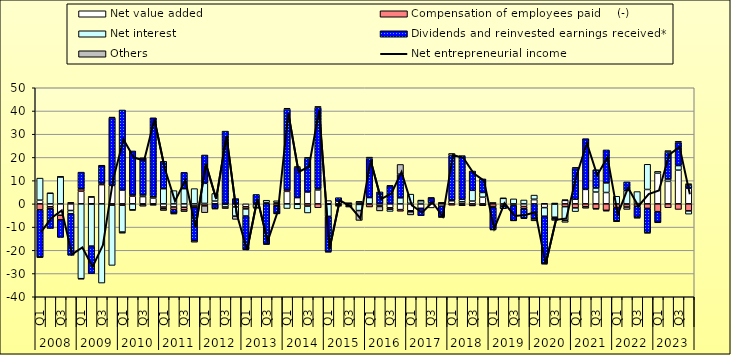
| Category | Net value added  | Compensation of employees paid    (-) | Net interest | Dividends and reinvested earnings received*  | Others |
|---|---|---|---|---|---|
| 0 | 1.59 | -2.55 | 9.5 | -20.36 | -0.1 |
| 1 | -1.24 | -0.85 | 4.57 | -8.5 | 0.02 |
| 2 | -4.88 | -1.98 | 11.64 | -7.58 | 0.04 |
| 3 | -2.85 | 0.42 | -1.43 | -17.85 | 0.11 |
| 4 | 5.44 | 1.01 | -32.22 | 7.22 | -0.11 |
| 5 | 2.99 | -0.09 | -18.1 | -11.84 | 0.07 |
| 6 | 8.28 | 0.65 | -34.11 | 7.5 | 0.03 |
| 7 | 7.94 | -0.55 | -25.95 | 29.09 | 0.35 |
| 8 | 5.97 | -0.56 | -11.59 | 34.46 | -0.49 |
| 9 | 3.29 | 0.55 | -2.58 | 18.96 | -0.17 |
| 10 | 3.13 | -0.35 | 0.71 | 16.02 | -0.68 |
| 11 | 2.47 | -0.22 | 0.59 | 34.01 | -0.4 |
| 12 | -1.36 | -0.77 | 6.53 | 11.79 | -0.74 |
| 13 | -1.34 | -1.12 | 5.71 | -1.51 | -0.43 |
| 14 | -1.44 | -1.11 | 6.53 | 7.04 | -0.78 |
| 15 | -0.9 | -0.54 | 6.57 | -14.43 | -0.64 |
| 16 | 0.19 | -0.87 | 8.65 | 12.22 | -2.92 |
| 17 | 1.19 | -0.1 | 3.28 | -1.75 | -0.41 |
| 18 | -0.19 | 0.06 | -1.15 | 31.27 | -0.69 |
| 19 | -1.32 | 0.05 | -3.96 | 2.24 | -1.4 |
| 20 | -1.25 | -0.92 | -3.07 | -14.38 | -0.13 |
| 21 | -0.28 | 0.17 | -1.24 | 3.89 | -0.34 |
| 22 | 0.46 | 0.09 | 1.02 | -17.23 | -0.28 |
| 23 | 0.55 | -0.81 | 0.79 | -3.32 | -0.08 |
| 24 | 5.38 | 0.63 | -2.01 | 34.84 | 0.33 |
| 25 | 2.69 | -0.14 | -2.01 | 13.1 | 0.21 |
| 26 | 5.12 | -0.95 | -2.97 | 14.54 | 0.37 |
| 27 | 5.98 | -1.67 | 0.7 | 34.79 | 0.5 |
| 28 | 1.41 | -0.18 | -5.19 | -15.17 | -0.28 |
| 29 | 1.09 | -0.42 | -0.22 | 1.58 | -0.37 |
| 30 | 0.51 | -0.04 | -0.7 | -0.16 | -0.47 |
| 31 | 0.84 | -0.24 | -2.64 | 0.13 | -4.24 |
| 32 | -0.23 | -1.11 | 2.71 | 16.88 | 0.54 |
| 33 | -0.9 | -0.23 | 0.18 | 4.99 | -1.9 |
| 34 | -1.7 | -0.6 | -0.96 | 7.74 | 0.03 |
| 35 | -2.48 | -0.7 | 2.61 | 10.17 | 4.19 |
| 36 | -2.97 | 0.22 | 3.97 | -0.46 | -1.32 |
| 37 | -1.9 | 0.15 | 1.27 | -3.16 | 0.03 |
| 38 | -1.74 | 0.21 | 0.41 | 1.92 | 0.03 |
| 39 | -0.99 | 0.43 | 0.01 | -4.61 | -0.19 |
| 40 | 1.32 | -0.6 | 0.38 | 19.12 | 0.9 |
| 41 | 0.87 | -0.28 | 1.1 | 18.81 | -0.54 |
| 42 | 1.2 | -0.67 | 4.63 | 8.32 | -0.16 |
| 43 | 2.87 | -0.58 | 2.03 | 5.86 | -0.08 |
| 44 | 0.62 | -1.15 | -0.36 | -9.52 | -0.17 |
| 45 | -0.35 | -0.65 | 2.38 | -1.07 | 0.06 |
| 46 | -0.13 | -0.59 | 2.15 | -6.41 | -0.13 |
| 47 | -1.14 | -0.96 | 1.68 | -4.04 | -0.22 |
| 48 | 1.82 | 0.18 | 1.78 | -6.5 | -0.81 |
| 49 | -1.62 | 0.17 | -3.69 | -20.24 | -0.45 |
| 50 | 0.37 | -0.09 | -5.66 | -0.77 | -0.6 |
| 51 | 1.5 | -1.21 | -5.83 | 0.29 | -0.9 |
| 52 | 2.02 | -1.74 | -1.59 | 13.41 | 0.22 |
| 53 | 6.23 | -1.26 | 0.11 | 21.75 | -0.64 |
| 54 | 5.09 | -2.08 | 1.76 | 7.86 | -0.17 |
| 55 | 4.89 | -2.79 | 4.15 | 14.2 | -0.35 |
| 56 | -0.07 | -1.51 | 3.28 | -5.67 | -0.44 |
| 57 | -0.24 | -1.13 | 5.75 | 3.72 | -1.03 |
| 58 | 0.11 | -1.01 | 5.19 | -4.72 | -0.49 |
| 59 | 6.2 | -1.94 | 10.85 | -10.35 | -0.4 |
| 60 | 13.18 | -3.37 | 0.82 | -4.49 | -0.29 |
| 61 | 9.7 | -1.67 | 1.01 | 11.61 | 0.63 |
| 62 | 14.52 | -2.4 | 1.97 | 9.92 | 0.56 |
| 63 | 6.79 | -3.03 | -1.41 | 1.37 | 0.54 |